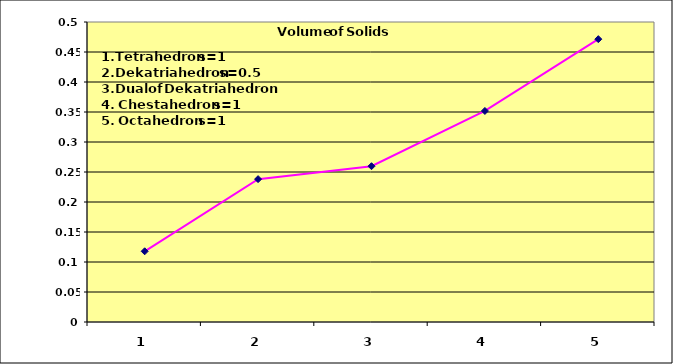
| Category | Series 0 |
|---|---|
| 0 | 0.118 |
| 1 | 0.238 |
| 2 | 0.26 |
| 3 | 0.352 |
| 4 | 0.471 |